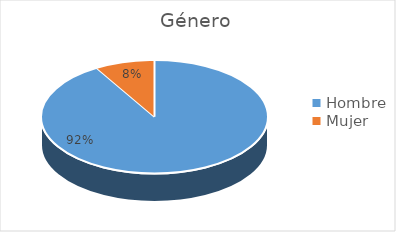
| Category | Series 0 |
|---|---|
| Hombre | 140 |
| Mujer | 13 |